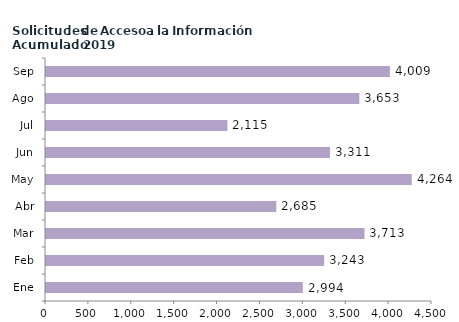
| Category | Series 0 |
|---|---|
| Ene | 2994 |
| Feb | 3243 |
| Mar | 3713 |
| Abr | 2685 |
| May | 4264 |
| Jun | 3311 |
| Jul | 2115 |
| Ago | 3653 |
| Sep | 4009 |